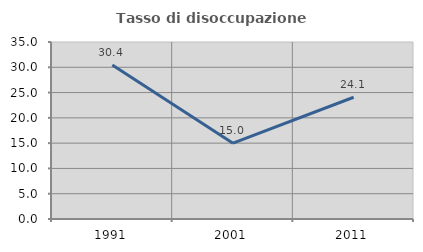
| Category | Tasso di disoccupazione giovanile  |
|---|---|
| 1991.0 | 30.435 |
| 2001.0 | 15 |
| 2011.0 | 24.074 |